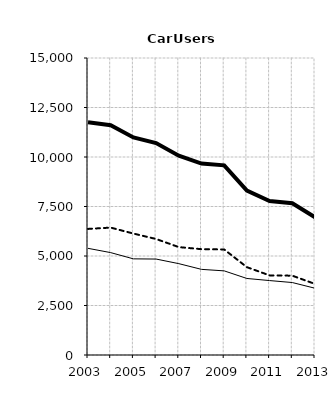
| Category | Built-up | Non built-up | Total |
|---|---|---|---|
| 2003.0 | 5387 | 6368 | 11755 |
| 2004.0 | 5171 | 6434 | 11605 |
| 2005.0 | 4856 | 6133 | 10989 |
| 2006.0 | 4846 | 5859 | 10705 |
| 2007.0 | 4614 | 5449 | 10063 |
| 2008.0 | 4325 | 5345 | 9670 |
| 2009.0 | 4249 | 5330 | 9579 |
| 2010.0 | 3865 | 4436 | 8301 |
| 2011.0 | 3759 | 4021 | 7780 |
| 2012.0 | 3660 | 4006 | 7666 |
| 2013.0 | 3372 | 3589 | 6961 |